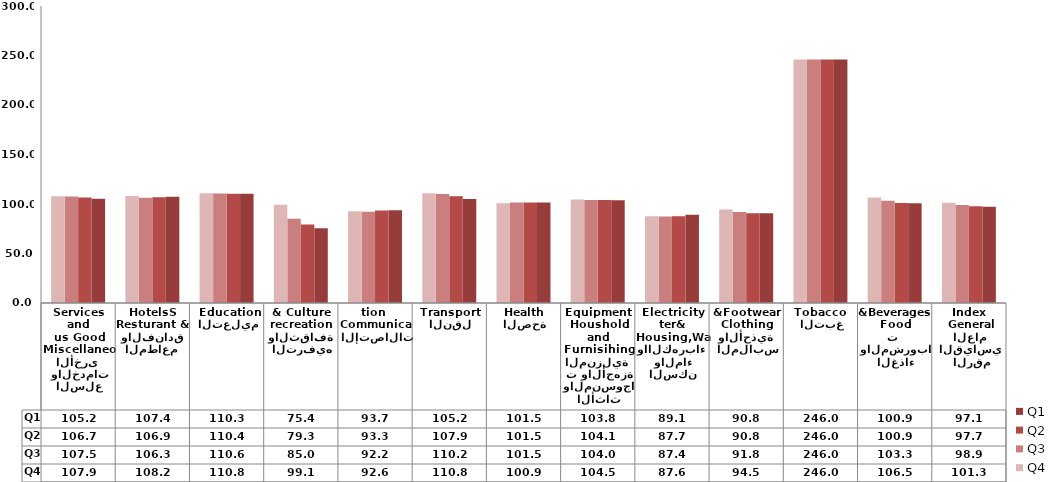
| Category | Q1 | Q2 | Q3 | Q4 |
|---|---|---|---|---|
|  الرقم القياسي العام
 General Index
 | 97.103 | 97.713 | 98.947 | 101.343 |
| الغذاء والمشروبات 
Food &Beverages | 100.863 | 100.94 | 103.347 | 106.457 |
| التبغ
 Tobacco  
 | 246 | 246 | 246 | 246 |
| الملابس والأحذية 
Clothing &Footwear
 | 90.777 | 90.757 | 91.84 | 94.467 |
| السكن والماء واالكهرباء 
Housing,Water& Electricity
 | 89.093 | 87.743 | 87.377 | 87.633 |
| الأثاث والمنسوجات والأجهزة المنزلية 
Furnisihing and Houshold Equipment | 103.77 | 104.06 | 104.01 | 104.5 |
| الصحة
Health | 101.46 | 101.46 | 101.49 | 100.85 |
| النقل
Transport | 105.173 | 107.873 | 110.173 | 110.8 |
| الإتصالات
Communication  | 93.67 | 93.347 | 92.217 | 92.61 |
| الترفيه والثقافة 
recreation & Culture | 75.443 | 79.303 | 84.993 | 99.143 |
| التعليم
 Education | 110.273 | 110.39 | 110.607 | 110.823 |
| المطاعم  والفنادق 
Resturant & HotelsS | 107.373 | 106.867 | 106.313 | 108.153 |
| السلع والخدمات الأخرى 
Miscellaneous Good and Services | 105.213 | 106.66 | 107.5 | 107.923 |